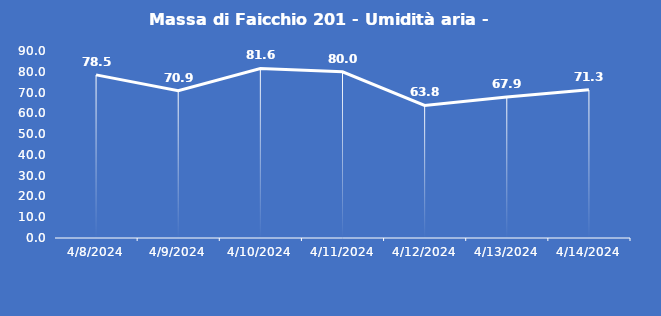
| Category | Massa di Faicchio 201 - Umidità aria - Grezzo (%) |
|---|---|
| 4/8/24 | 78.5 |
| 4/9/24 | 70.9 |
| 4/10/24 | 81.6 |
| 4/11/24 | 80 |
| 4/12/24 | 63.8 |
| 4/13/24 | 67.9 |
| 4/14/24 | 71.3 |